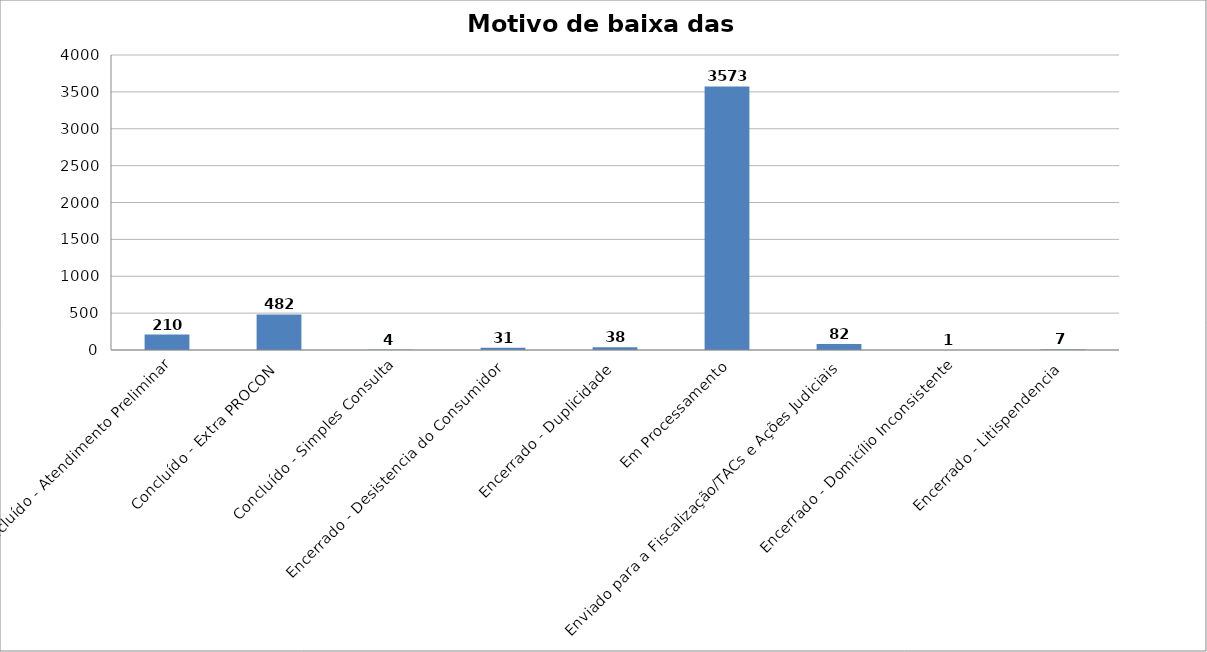
| Category | Motivo de baixa das Reclamações |
|---|---|
| Concluído - Atendimento Preliminar | 210 |
| Concluído - Extra PROCON | 482 |
| Concluído - Simples Consulta | 4 |
| Encerrado - Desistencia do Consumidor | 31 |
| Encerrado - Duplicidade | 38 |
| Em Processamento | 3573 |
| Enviado para a Fiscalização/TACs e Ações Judiciais | 82 |
| Encerrado - Domicílio Inconsistente | 1 |
| Encerrado - Litispendencia | 7 |